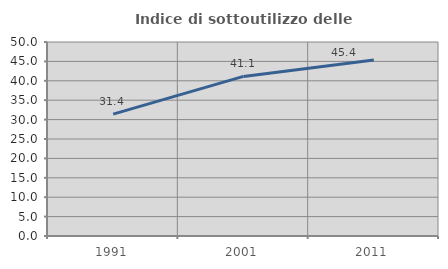
| Category | Indice di sottoutilizzo delle abitazioni  |
|---|---|
| 1991.0 | 31.399 |
| 2001.0 | 41.134 |
| 2011.0 | 45.364 |